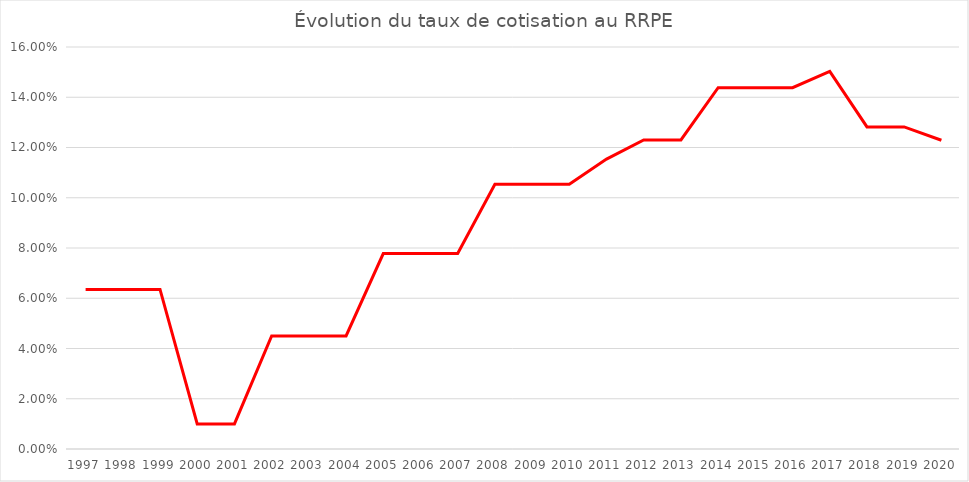
| Category | Series 0 |
|---|---|
| 1997.0 | 0.064 |
| 1998.0 | 0.064 |
| 1999.0 | 0.064 |
| 2000.0 | 0.01 |
| 2001.0 | 0.01 |
| 2002.0 | 0.045 |
| 2003.0 | 0.045 |
| 2004.0 | 0.045 |
| 2005.0 | 0.078 |
| 2006.0 | 0.078 |
| 2007.0 | 0.078 |
| 2008.0 | 0.105 |
| 2009.0 | 0.105 |
| 2010.0 | 0.105 |
| 2011.0 | 0.115 |
| 2012.0 | 0.123 |
| 2013.0 | 0.123 |
| 2014.0 | 0.144 |
| 2015.0 | 0.144 |
| 2016.0 | 0.144 |
| 2017.0 | 0.15 |
| 2018.0 | 0.128 |
| 2019.0 | 0.128 |
| 2020.0 | 0.123 |